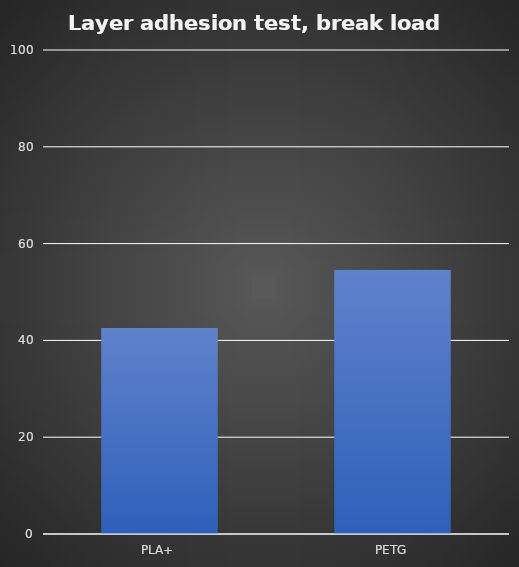
| Category | Average |
|---|---|
| PLA+ | 42.55 |
| PETG | 54.6 |